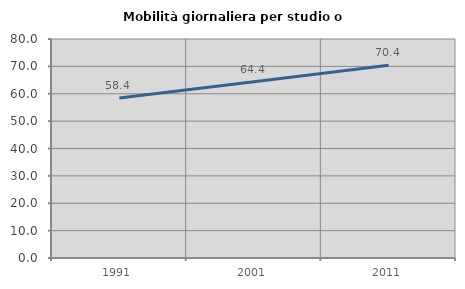
| Category | Mobilità giornaliera per studio o lavoro |
|---|---|
| 1991.0 | 58.423 |
| 2001.0 | 64.377 |
| 2011.0 | 70.439 |